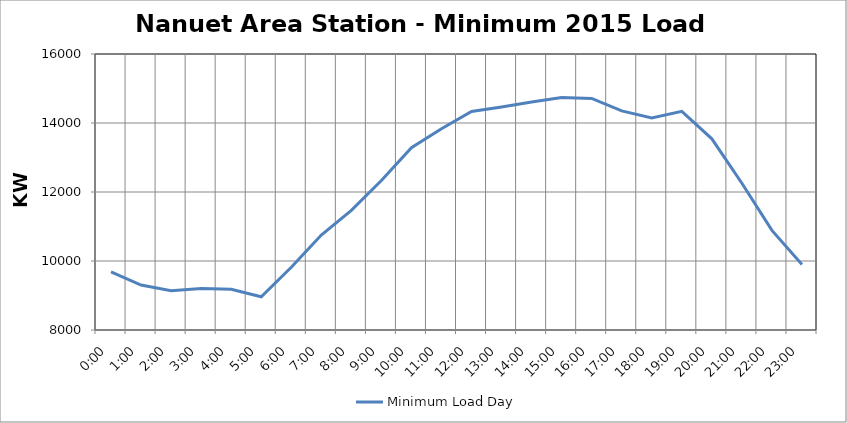
| Category | Minimum Load Day |
|---|---|
| 0.0 | 9685.2 |
| 0.041666666666666664 | 9301.6 |
| 0.08333333333333333 | 9139.2 |
| 0.125 | 9203.6 |
| 0.16666666666666666 | 9178.4 |
| 0.20833333333333334 | 8962.8 |
| 0.25 | 9816.8 |
| 0.2916666666666667 | 10752 |
| 0.3333333333333333 | 11468.8 |
| 0.375 | 12331.2 |
| 0.4166666666666667 | 13286 |
| 0.4583333333333333 | 13834.8 |
| 0.5 | 14336 |
| 0.5416666666666666 | 14464.8 |
| 0.5833333333333334 | 14607.6 |
| 0.625 | 14739.2 |
| 0.6666666666666666 | 14711.2 |
| 0.7083333333333334 | 14350 |
| 0.75 | 14142.8 |
| 0.7916666666666666 | 14336 |
| 0.8333333333333334 | 13540.8 |
| 0.875 | 12252.8 |
| 0.9166666666666666 | 10886.4 |
| 0.9583333333333334 | 9900.8 |